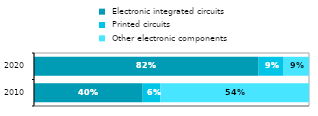
| Category |  Electronic integrated circuits |  Printed circuits |  Other electronic components |
|---|---|---|---|
| 2010 | 0.395 | 0.065 | 0.54 |
| 2020 | 0.817 | 0.091 | 0.092 |